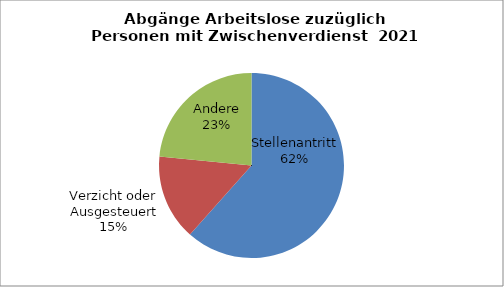
| Category | Series 0 |
|---|---|
| Stellenantritt | 0.616 |
| Verzicht oder Ausgesteuert | 0.15 |
| Andere | 0.234 |